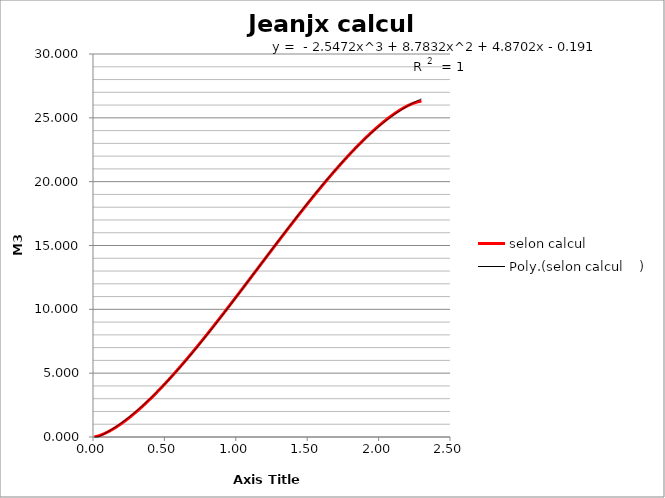
| Category | selon calcul |
|---|---|
| 0.01 | 0.012 |
| 0.02 | 0.033 |
| 0.03 | 0.061 |
| 0.04 | 0.095 |
| 0.05 | 0.132 |
| 0.06 | 0.174 |
| 0.07 | 0.22 |
| 0.08 | 0.269 |
| 0.09 | 0.321 |
| 0.1 | 0.376 |
| 0.11 | 0.434 |
| 0.12 | 0.494 |
| 0.13 | 0.557 |
| 0.14 | 0.623 |
| 0.15 | 0.691 |
| 0.16 | 0.761 |
| 0.17 | 0.833 |
| 0.18 | 0.908 |
| 0.19 | 0.985 |
| 0.2 | 1.063 |
| 0.21 | 1.143 |
| 0.22 | 1.226 |
| 0.23 | 1.31 |
| 0.24 | 1.396 |
| 0.25 | 1.483 |
| 0.26 | 1.572 |
| 0.27 | 1.663 |
| 0.28 | 1.756 |
| 0.29 | 1.85 |
| 0.3 | 1.945 |
| 0.31 | 2.042 |
| 0.32 | 2.14 |
| 0.33 | 2.24 |
| 0.34 | 2.341 |
| 0.35 | 2.444 |
| 0.36 | 2.547 |
| 0.37 | 2.652 |
| 0.38 | 2.759 |
| 0.39 | 2.866 |
| 0.4 | 2.975 |
| 0.41 | 3.085 |
| 0.42 | 3.196 |
| 0.43 | 3.308 |
| 0.44 | 3.421 |
| 0.45 | 3.535 |
| 0.46 | 3.651 |
| 0.47 | 3.767 |
| 0.48 | 3.884 |
| 0.49 | 4.003 |
| 0.5 | 4.122 |
| 0.51 | 4.242 |
| 0.52 | 4.363 |
| 0.53 | 4.485 |
| 0.54 | 4.608 |
| 0.55 | 4.732 |
| 0.56 | 4.857 |
| 0.57 | 4.983 |
| 0.58 | 5.109 |
| 0.59 | 5.236 |
| 0.6 | 5.364 |
| 0.61 | 5.493 |
| 0.62 | 5.622 |
| 0.63 | 5.752 |
| 0.64 | 5.883 |
| 0.65 | 6.014 |
| 0.66 | 6.147 |
| 0.67 | 6.279 |
| 0.68 | 6.413 |
| 0.69 | 6.547 |
| 0.7 | 6.682 |
| 0.71 | 6.817 |
| 0.72 | 6.953 |
| 0.73 | 7.09 |
| 0.74 | 7.227 |
| 0.75 | 7.364 |
| 0.76 | 7.502 |
| 0.77 | 7.641 |
| 0.78 | 7.78 |
| 0.79 | 7.919 |
| 0.8 | 8.06 |
| 0.81 | 8.2 |
| 0.82 | 8.341 |
| 0.83 | 8.482 |
| 0.84 | 8.624 |
| 0.85 | 8.766 |
| 0.86 | 8.909 |
| 0.87 | 9.052 |
| 0.88 | 9.195 |
| 0.89 | 9.339 |
| 0.9 | 9.483 |
| 0.91 | 9.627 |
| 0.92 | 9.771 |
| 0.93 | 9.916 |
| 0.94 | 10.061 |
| 0.95 | 10.207 |
| 0.96 | 10.352 |
| 0.97 | 10.498 |
| 0.98 | 10.644 |
| 0.99 | 10.791 |
| 1.0 | 10.937 |
| 1.01 | 11.084 |
| 1.02 | 11.231 |
| 1.03 | 11.378 |
| 1.04 | 11.525 |
| 1.05 | 11.672 |
| 1.06 | 11.82 |
| 1.07 | 11.967 |
| 1.08 | 12.115 |
| 1.09 | 12.263 |
| 1.1 | 12.411 |
| 1.11 | 12.558 |
| 1.12 | 12.706 |
| 1.13 | 12.854 |
| 1.14 | 13.002 |
| 1.15 | 13.15 |
| 1.16 | 13.298 |
| 1.17 | 13.446 |
| 1.18 | 13.594 |
| 1.19 | 13.742 |
| 1.2 | 13.89 |
| 1.21 | 14.038 |
| 1.22 | 14.186 |
| 1.23 | 14.333 |
| 1.24 | 14.481 |
| 1.25 | 14.628 |
| 1.26 | 14.776 |
| 1.27 | 14.923 |
| 1.28 | 15.07 |
| 1.29 | 15.217 |
| 1.3 | 15.364 |
| 1.31 | 15.51 |
| 1.32 | 15.656 |
| 1.33 | 15.803 |
| 1.34 | 15.948 |
| 1.35 | 16.094 |
| 1.36 | 16.239 |
| 1.37 | 16.385 |
| 1.38 | 16.529 |
| 1.39 | 16.674 |
| 1.4 | 16.818 |
| 1.41 | 16.962 |
| 1.42 | 17.106 |
| 1.43 | 17.249 |
| 1.44 | 17.392 |
| 1.45 | 17.535 |
| 1.46 | 17.677 |
| 1.47 | 17.818 |
| 1.48 | 17.96 |
| 1.49 | 18.101 |
| 1.5 | 18.241 |
| 1.51 | 18.381 |
| 1.52 | 18.521 |
| 1.53 | 18.66 |
| 1.54 | 18.799 |
| 1.55 | 18.937 |
| 1.56 | 19.074 |
| 1.57 | 19.211 |
| 1.58 | 19.348 |
| 1.59 | 19.484 |
| 1.6 | 19.619 |
| 1.61 | 19.754 |
| 1.62 | 19.888 |
| 1.63 | 20.021 |
| 1.64 | 20.154 |
| 1.65 | 20.286 |
| 1.66 | 20.418 |
| 1.67 | 20.549 |
| 1.68 | 20.679 |
| 1.69 | 20.808 |
| 1.7 | 20.937 |
| 1.71 | 21.065 |
| 1.72 | 21.192 |
| 1.73 | 21.318 |
| 1.74 | 21.444 |
| 1.75 | 21.568 |
| 1.76 | 21.692 |
| 1.77 | 21.815 |
| 1.78 | 21.937 |
| 1.79 | 22.059 |
| 1.8 | 22.179 |
| 1.81 | 22.298 |
| 1.82 | 22.417 |
| 1.83 | 22.534 |
| 1.84 | 22.65 |
| 1.85 | 22.766 |
| 1.86 | 22.88 |
| 1.87 | 22.993 |
| 1.88 | 23.105 |
| 1.89 | 23.216 |
| 1.9 | 23.326 |
| 1.91 | 23.435 |
| 1.92 | 23.542 |
| 1.93 | 23.648 |
| 1.94 | 23.754 |
| 1.95 | 23.857 |
| 1.96 | 23.96 |
| 1.97 | 24.061 |
| 1.98 | 24.161 |
| 1.99 | 24.259 |
| 2.0 | 24.356 |
| 2.01 | 24.451 |
| 2.02 | 24.545 |
| 2.03 | 24.638 |
| 2.04 | 24.728 |
| 2.05 | 24.818 |
| 2.06 | 24.905 |
| 2.07 | 24.991 |
| 2.08 | 25.075 |
| 2.09 | 25.157 |
| 2.1 | 25.238 |
| 2.11 | 25.316 |
| 2.12 | 25.393 |
| 2.13 | 25.467 |
| 2.14 | 25.54 |
| 2.15 | 25.61 |
| 2.16 | 25.678 |
| 2.17 | 25.743 |
| 2.18 | 25.807 |
| 2.19 | 25.867 |
| 2.2 | 25.925 |
| 2.21 | 25.98 |
| 2.22 | 26.032 |
| 2.23 | 26.081 |
| 2.24 | 26.127 |
| 2.25 | 26.168 |
| 2.26 | 26.206 |
| 2.27 | 26.239 |
| 2.28 | 26.268 |
| 2.29 | 26.289 |
| 2.3 | 26.301 |